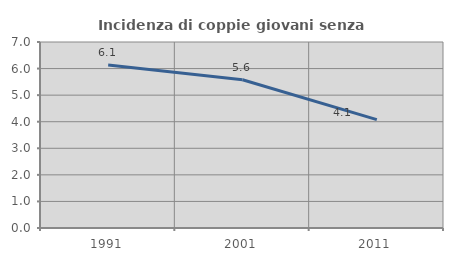
| Category | Incidenza di coppie giovani senza figli |
|---|---|
| 1991.0 | 6.134 |
| 2001.0 | 5.578 |
| 2011.0 | 4.08 |